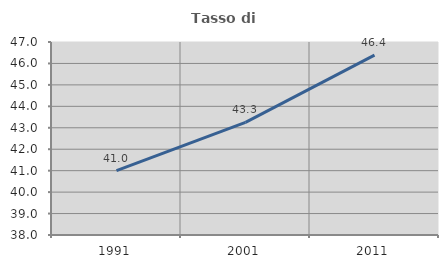
| Category | Tasso di occupazione   |
|---|---|
| 1991.0 | 40.998 |
| 2001.0 | 43.254 |
| 2011.0 | 46.387 |